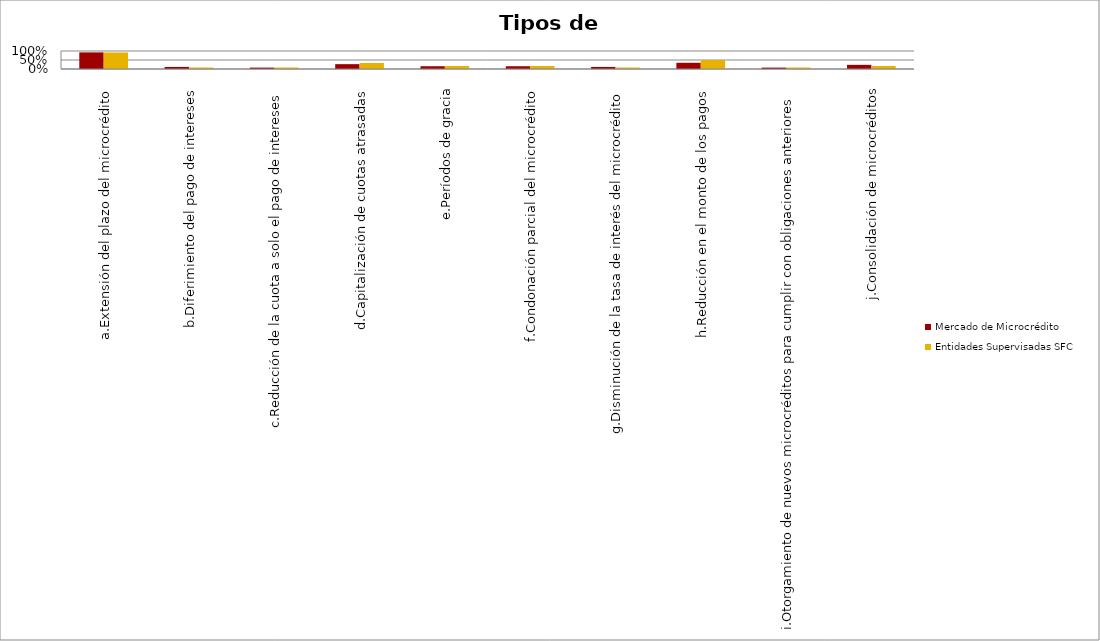
| Category | Mercado de Microcrédito | Entidades Supervisadas SFC |
|---|---|---|
| a.Extensión del plazo del microcrédito | 0.923 | 0.917 |
| b.Diferimiento del pago de intereses | 0.115 | 0.083 |
| c.Reducción de la cuota a solo el pago de intereses | 0.077 | 0.083 |
| d.Capitalización de cuotas atrasadas | 0.269 | 0.333 |
| e.Períodos de gracia | 0.154 | 0.167 |
| f.Condonación parcial del microcrédito | 0.154 | 0.167 |
| g.Disminución de la tasa de interés del microcrédito | 0.115 | 0.083 |
| h.Reducción en el monto de los pagos | 0.346 | 0.5 |
| i.Otorgamiento de nuevos microcréditos para cumplir con obligaciones anteriores | 0.077 | 0.083 |
| j.Consolidación de microcréditos | 0.231 | 0.167 |